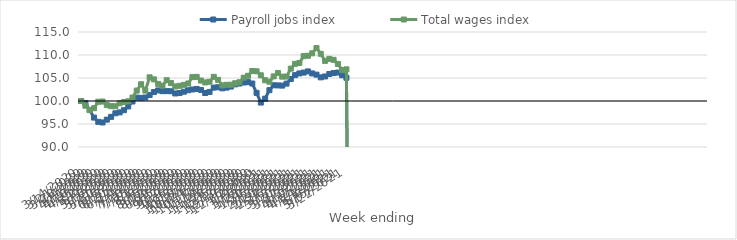
| Category | Payroll jobs index | Total wages index |
|---|---|---|
| 14/03/2020 | 100 | 100 |
| 21/03/2020 | 99.57 | 98.976 |
| 28/03/2020 | 98.032 | 98.038 |
| 04/04/2020 | 96.394 | 98.433 |
| 11/04/2020 | 95.464 | 99.837 |
| 18/04/2020 | 95.334 | 99.885 |
| 25/04/2020 | 95.951 | 99.104 |
| 02/05/2020 | 96.551 | 98.877 |
| 09/05/2020 | 97.33 | 98.864 |
| 16/05/2020 | 97.521 | 99.506 |
| 23/05/2020 | 97.998 | 99.773 |
| 30/05/2020 | 98.817 | 99.93 |
| 06/06/2020 | 99.89 | 100.749 |
| 13/06/2020 | 100.735 | 102.26 |
| 20/06/2020 | 100.683 | 103.645 |
| 27/06/2020 | 100.763 | 102.278 |
| 04/07/2020 | 101.3 | 105.148 |
| 11/07/2020 | 101.946 | 104.702 |
| 18/07/2020 | 102.301 | 103.718 |
| 25/07/2020 | 102.139 | 103.33 |
| 01/08/2020 | 102.144 | 104.52 |
| 08/08/2020 | 102.128 | 103.902 |
| 15/08/2020 | 101.639 | 103.164 |
| 22/08/2020 | 101.726 | 103.3 |
| 29/08/2020 | 102.018 | 103.508 |
| 05/09/2020 | 102.331 | 103.806 |
| 12/09/2020 | 102.503 | 105.192 |
| 19/09/2020 | 102.612 | 105.248 |
| 26/09/2020 | 102.402 | 104.446 |
| 03/10/2020 | 101.737 | 104.039 |
| 10/10/2020 | 101.97 | 104.184 |
| 17/10/2020 | 102.913 | 105.249 |
| 24/10/2020 | 102.987 | 104.6 |
| 31/10/2020 | 102.757 | 103.398 |
| 07/11/2020 | 102.908 | 103.517 |
| 14/11/2020 | 103.142 | 103.541 |
| 21/11/2020 | 103.617 | 103.862 |
| 28/11/2020 | 103.796 | 104.073 |
| 05/12/2020 | 104.016 | 105.076 |
| 12/12/2020 | 104.101 | 105.476 |
| 19/12/2020 | 103.8 | 106.511 |
| 26/12/2020 | 101.768 | 106.464 |
| 02/01/2021 | 99.658 | 105.585 |
| 09/01/2021 | 100.506 | 104.504 |
| 16/01/2021 | 102.354 | 104.187 |
| 23/01/2021 | 103.424 | 105.354 |
| 30/01/2021 | 103.386 | 106.096 |
| 06/02/2021 | 103.348 | 105.293 |
| 13/02/2021 | 103.776 | 105.318 |
| 20/02/2021 | 104.778 | 107.035 |
| 27/02/2021 | 105.622 | 108.084 |
| 06/03/2021 | 105.992 | 108.267 |
| 13/03/2021 | 106.176 | 109.75 |
| 20/03/2021 | 106.432 | 109.837 |
| 27/03/2021 | 105.993 | 110.364 |
| 03/04/2021 | 105.729 | 111.512 |
| 10/04/2021 | 105.146 | 110.256 |
| 17/04/2021 | 105.334 | 108.722 |
| 24/04/2021 | 105.865 | 109.164 |
| 01/05/2021 | 106.078 | 108.956 |
| 08/05/2021 | 106.187 | 108.056 |
| 15/05/2021 | 105.59 | 106.722 |
| 22/05/2021 | 105.048 | 106.883 |